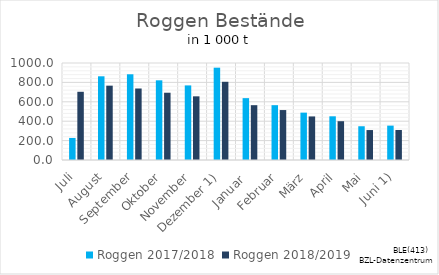
| Category | Roggen |
|---|---|
| Juli | 703.26 |
| August | 766.352 |
| September | 737.118 |
| Oktober | 693.535 |
| November | 656.346 |
| Dezember 1) | 806.234 |
| Januar  | 565.177 |
| Februar | 514.929 |
| März | 449.117 |
| April | 399.896 |
| Mai | 308.726 |
| Juni 1) | 309.149 |